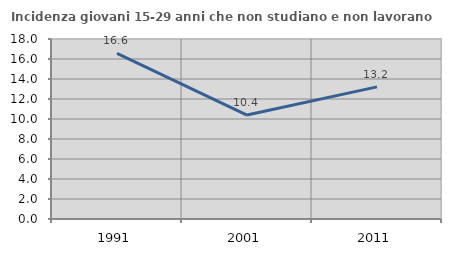
| Category | Incidenza giovani 15-29 anni che non studiano e non lavorano  |
|---|---|
| 1991.0 | 16.567 |
| 2001.0 | 10.394 |
| 2011.0 | 13.216 |